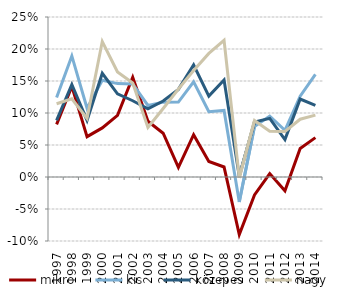
| Category | mikro | kis | közepes | nagy |
|---|---|---|---|---|
| 1997.0 | 0.082 | 0.124 | 0.088 | 0.114 |
| 1998.0 | 0.142 | 0.189 | 0.144 | 0.122 |
| 1999.0 | 0.063 | 0.107 | 0.088 | 0.091 |
| 2000.0 | 0.077 | 0.151 | 0.162 | 0.212 |
| 2001.0 | 0.096 | 0.146 | 0.13 | 0.164 |
| 2002.0 | 0.156 | 0.145 | 0.119 | 0.147 |
| 2003.0 | 0.087 | 0.112 | 0.106 | 0.077 |
| 2004.0 | 0.068 | 0.117 | 0.119 | 0.107 |
| 2005.0 | 0.015 | 0.117 | 0.137 | 0.137 |
| 2006.0 | 0.066 | 0.149 | 0.175 | 0.166 |
| 2007.0 | 0.024 | 0.102 | 0.126 | 0.193 |
| 2008.0 | 0.016 | 0.104 | 0.152 | 0.214 |
| 2009.0 | -0.09 | -0.039 | 0.001 | -0.001 |
| 2010.0 | -0.028 | 0.079 | 0.086 | 0.088 |
| 2011.0 | 0.005 | 0.095 | 0.092 | 0.071 |
| 2012.0 | -0.022 | 0.073 | 0.058 | 0.071 |
| 2013.0 | 0.045 | 0.126 | 0.122 | 0.09 |
| 2014.0 | 0.062 | 0.16 | 0.112 | 0.097 |